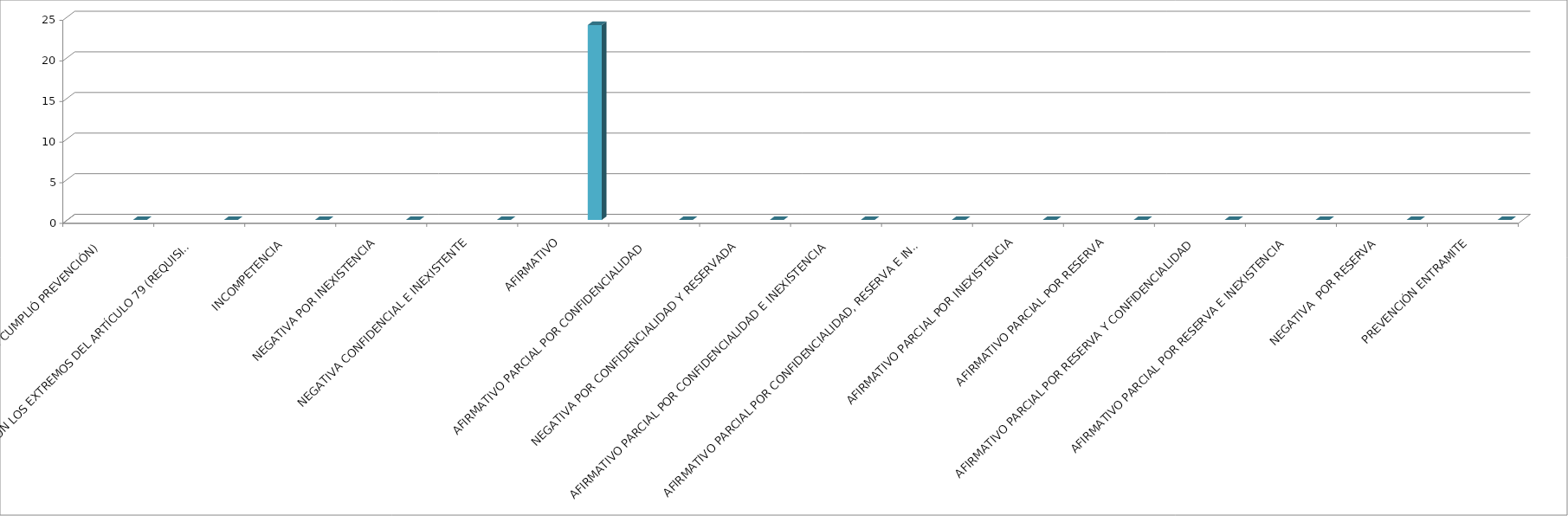
| Category | Series 0 | Series 1 | Series 2 | Series 3 | Series 4 |
|---|---|---|---|---|---|
| SE TIENE POR NO PRESENTADA ( NO CUMPLIÓ PREVENCIÓN) |  |  |  |  | 0 |
| NO CUMPLIO CON LOS EXTREMOS DEL ARTÍCULO 79 (REQUISITOS) |  |  |  |  | 0 |
| INCOMPETENCIA  |  |  |  |  | 0 |
| NEGATIVA POR INEXISTENCIA |  |  |  |  | 0 |
| NEGATIVA CONFIDENCIAL E INEXISTENTE |  |  |  |  | 0 |
| AFIRMATIVO |  |  |  |  | 24 |
| AFIRMATIVO PARCIAL POR CONFIDENCIALIDAD  |  |  |  |  | 0 |
| NEGATIVA POR CONFIDENCIALIDAD Y RESERVADA |  |  |  |  | 0 |
| AFIRMATIVO PARCIAL POR CONFIDENCIALIDAD E INEXISTENCIA |  |  |  |  | 0 |
| AFIRMATIVO PARCIAL POR CONFIDENCIALIDAD, RESERVA E INEXISTENCIA |  |  |  |  | 0 |
| AFIRMATIVO PARCIAL POR INEXISTENCIA |  |  |  |  | 0 |
| AFIRMATIVO PARCIAL POR RESERVA |  |  |  |  | 0 |
| AFIRMATIVO PARCIAL POR RESERVA Y CONFIDENCIALIDAD |  |  |  |  | 0 |
| AFIRMATIVO PARCIAL POR RESERVA E INEXISTENCIA |  |  |  |  | 0 |
| NEGATIVA  POR RESERVA |  |  |  |  | 0 |
| PREVENCIÓN ENTRAMITE |  |  |  |  | 0 |